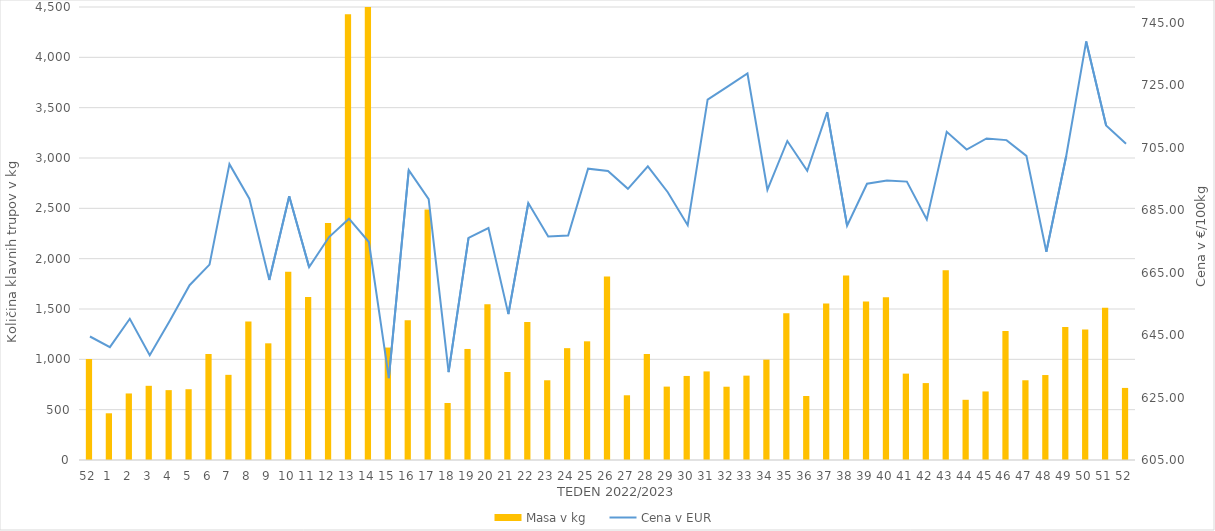
| Category | Masa v kg |
|---|---|
| 52.0 | 1003 |
| 1.0 | 464 |
| 2.0 | 661 |
| 3.0 | 737 |
| 4.0 | 694 |
| 5.0 | 703 |
| 6.0 | 1053 |
| 7.0 | 846 |
| 8.0 | 1377 |
| 9.0 | 1159 |
| 10.0 | 1870 |
| 11.0 | 1618 |
| 12.0 | 2355 |
| 13.0 | 4429 |
| 14.0 | 5273 |
| 15.0 | 1117 |
| 16.0 | 1388 |
| 17.0 | 2489 |
| 18.0 | 566 |
| 19.0 | 1103 |
| 20.0 | 1546 |
| 21.0 | 874 |
| 22.0 | 1371 |
| 23.0 | 792 |
| 24.0 | 1111 |
| 25.0 | 1179 |
| 26.0 | 1822 |
| 27.0 | 643 |
| 28.0 | 1053 |
| 29.0 | 729 |
| 30.0 | 835 |
| 31.0 | 880 |
| 32.0 | 728 |
| 33.0 | 838 |
| 34.0 | 997 |
| 35.0 | 1458 |
| 36.0 | 636 |
| 37.0 | 1554 |
| 38.0 | 1834 |
| 39.0 | 1575 |
| 40.0 | 1617 |
| 41.0 | 858 |
| 42.0 | 764 |
| 43.0 | 1884 |
| 44.0 | 598 |
| 45.0 | 681 |
| 46.0 | 1282 |
| 47.0 | 792 |
| 48.0 | 844 |
| 49.0 | 1322 |
| 50.0 | 1296 |
| 51.0 | 1512 |
| 52.0 | 716 |